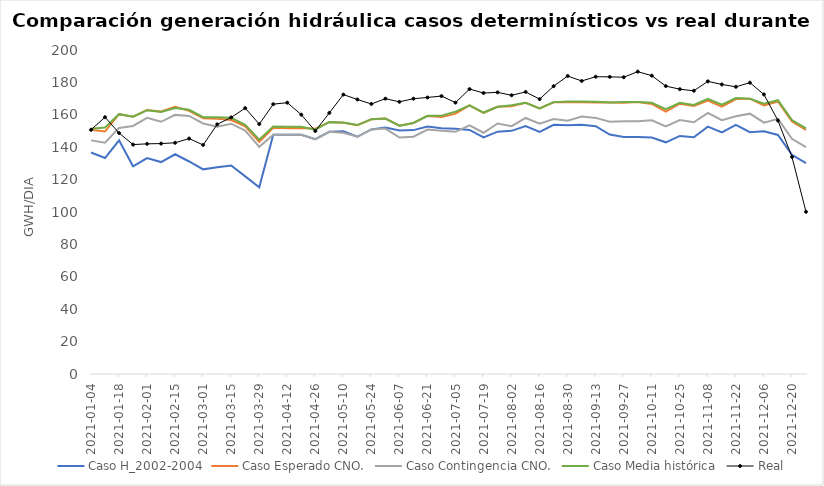
| Category | Caso H_2002-2004 | Caso Esperado CNO. | Caso Contingencia CNO. | Caso Media histórica | Real |
|---|---|---|---|---|---|
| 2021-01-04 | 136.706 | 150.814 | 144.214 | 151.443 | 150.732 |
| 2021-01-11 | 133.323 | 149.671 | 142.817 | 152.114 | 158.527 |
| 2021-01-18 | 144.243 | 160.386 | 151.914 | 160.386 | 148.746 |
| 2021-01-25 | 128.186 | 158.786 | 153.129 | 158.786 | 141.612 |
| 2021-02-01 | 133.263 | 162.9 | 158.171 | 162.857 | 142.08 |
| 2021-02-08 | 130.821 | 162.029 | 155.686 | 161.743 | 142.238 |
| 2021-02-15 | 135.643 | 164.929 | 159.943 | 164.129 | 142.728 |
| 2021-02-22 | 131.173 | 162.486 | 159.271 | 163.071 | 145.331 |
| 2021-03-01 | 126.321 | 157.871 | 154.671 | 158.514 | 141.394 |
| 2021-03-08 | 127.6 | 157.514 | 152.6 | 158.5 | 154.094 |
| 2021-03-15 | 128.694 | 156.8 | 154.5 | 158.129 | 158.39 |
| 2021-03-22 | 121.967 | 152.886 | 150.314 | 153.757 | 164.119 |
| 2021-03-29 | 115.234 | 143.271 | 140.209 | 144.671 | 154.261 |
| 2021-04-05 | 147.629 | 151.957 | 147.614 | 152.7 | 166.561 |
| 2021-04-12 | 147.671 | 151.629 | 147.657 | 152.571 | 167.479 |
| 2021-04-19 | 147.686 | 151.8 | 147.671 | 152.571 | 160.07 |
| 2021-04-26 | 144.971 | 151.357 | 144.971 | 150.857 | 149.986 |
| 2021-05-03 | 149.486 | 155.543 | 149.471 | 155.614 | 161.16 |
| 2021-05-10 | 149.843 | 155.157 | 148.957 | 155.214 | 172.481 |
| 2021-05-17 | 146.443 | 153.6 | 146.443 | 153.657 | 169.471 |
| 2021-05-24 | 150.986 | 157.214 | 150.986 | 157.243 | 166.672 |
| 2021-05-31 | 152.157 | 157.7 | 151.5 | 157.714 | 169.959 |
| 2021-06-07 | 150.329 | 153.257 | 145.943 | 153.271 | 167.997 |
| 2021-06-14 | 150.543 | 154.943 | 146.514 | 154.943 | 169.937 |
| 2021-06-21 | 152.7 | 159.3 | 150.871 | 159.4 | 170.681 |
| 2021-06-28 | 151.686 | 158.571 | 150.1 | 159.386 | 171.57 |
| 2021-07-05 | 151.314 | 160.7 | 149.486 | 161.986 | 167.507 |
| 2021-07-12 | 150.657 | 165.829 | 153.457 | 165.8 | 175.888 |
| 2021-07-19 | 146.057 | 161.243 | 148.929 | 161.4 | 173.445 |
| 2021-07-26 | 149.6 | 164.9 | 154.657 | 164.971 | 173.86 |
| 2021-08-02 | 150.086 | 165.257 | 153.014 | 165.886 | 172.056 |
| 2021-08-09 | 153 | 167.414 | 158.043 | 167.414 | 174.113 |
| 2021-08-16 | 149.5 | 163.957 | 154.486 | 163.929 | 169.679 |
| 2021-08-23 | 153.8 | 167.771 | 157.4 | 167.829 | 177.663 |
| 2021-08-30 | 153.571 | 167.7 | 156.371 | 168.214 | 183.947 |
| 2021-09-06 | 153.914 | 167.686 | 158.9 | 168.171 | 180.879 |
| 2021-09-13 | 152.986 | 167.586 | 158.086 | 168.1 | 183.502 |
| 2021-09-20 | 147.829 | 167.571 | 155.743 | 167.571 | 183.418 |
| 2021-09-27 | 146.243 | 167.486 | 156.071 | 167.9 | 183.192 |
| 2021-10-04 | 146.371 | 167.929 | 156.086 | 167.957 | 186.636 |
| 2021-10-11 | 145.957 | 166.7 | 156.643 | 167.443 | 184.156 |
| 2021-10-18 | 143.014 | 161.929 | 152.843 | 163.5 | 177.713 |
| 2021-10-25 | 146.957 | 166.857 | 156.771 | 167.457 | 175.809 |
| 2021-11-01 | 146.129 | 165.414 | 155.4 | 166.057 | 174.825 |
| 2021-11-08 | 152.686 | 168.8 | 161.214 | 169.886 | 180.631 |
| 2021-11-15 | 149.157 | 165.086 | 156.643 | 166.314 | 178.734 |
| 2021-11-22 | 153.8 | 169.714 | 159.057 | 170.371 | 177.271 |
| 2021-11-29 | 149.286 | 169.943 | 160.7 | 169.986 | 179.824 |
| 2021-12-06 | 149.786 | 165.829 | 155.157 | 166.786 | 172.547 |
| 2021-12-13 | 147.557 | 168.214 | 157.471 | 169.014 | 156.461 |
| 2021-12-20 | 135.269 | 155.9 | 145.186 | 156.757 | 133.962 |
| 2021-12-27 | 130.106 | 150.714 | 140.033 | 151.571 | 100.138 |